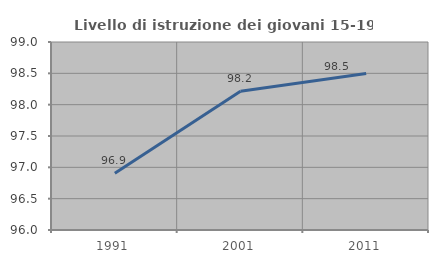
| Category | Livello di istruzione dei giovani 15-19 anni |
|---|---|
| 1991.0 | 96.907 |
| 2001.0 | 98.214 |
| 2011.0 | 98.496 |